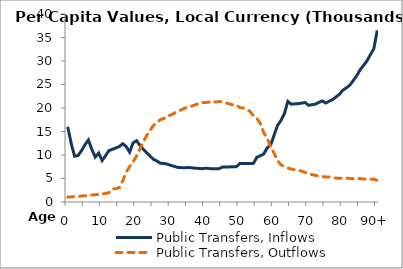
| Category | Public Transfers, Inflows | Public Transfers, Outflows |
|---|---|---|
| 0 | 16000.82 | 1045.959 |
|  | 12501.164 | 1095.797 |
| 2 | 9726.468 | 1143.166 |
| 3 | 9887.669 | 1197.292 |
| 4 | 10917.033 | 1256.027 |
| 5 | 12157.376 | 1331.117 |
| 6 | 13185.985 | 1404.079 |
| 7 | 11217.711 | 1478.851 |
| 8 | 9565.005 | 1554.729 |
| 9 | 10409.218 | 1621.978 |
| 10 | 8830.918 | 1675.22 |
| 11 | 9871.678 | 1847.643 |
| 12 | 10943.74 | 1990.622 |
| 13 | 11212.076 | 2791.878 |
| 14 | 11502.598 | 2841.088 |
| 15 | 11790.371 | 3087.532 |
| 16 | 12399.684 | 4474.458 |
| 17 | 11797.532 | 6336.393 |
| 18 | 10609.519 | 7537.712 |
| 19 | 12583.361 | 8544.975 |
| 20 | 13034.698 | 9774.763 |
| 21 | 12037.059 | 11293.654 |
| 22 | 11183.193 | 12842.268 |
| 23 | 10465.634 | 14183.222 |
| 24 | 9719.062 | 15336.619 |
| 25 | 9048.269 | 16333.851 |
| 26 | 8691.607 | 17009.216 |
| 27 | 8228.677 | 17536.9 |
| 28 | 8197.211 | 17804.588 |
| 29 | 8035.223 | 18296.72 |
| 30 | 7782.108 | 18511.792 |
| 31 | 7579.67 | 18916.234 |
| 32 | 7340.543 | 19241.319 |
| 33 | 7323.218 | 19618.755 |
| 34 | 7261.246 | 19941.262 |
| 35 | 7350.936 | 20209.922 |
| 36 | 7288.927 | 20401.244 |
| 37 | 7189.29 | 20648.723 |
| 38 | 7152.535 | 20917.069 |
| 39 | 7089.404 | 21120.851 |
| 40 | 7183.085 | 21174.739 |
| 41 | 7135.233 | 21248.306 |
| 42 | 7068.366 | 21385.25 |
| 43 | 7094.99 | 21270.912 |
| 44 | 7086.59 | 21365.036 |
| 45 | 7426.679 | 21316.796 |
| 46 | 7458.355 | 21074.225 |
| 47 | 7472.102 | 20875.161 |
| 48 | 7481.109 | 20670.945 |
| 49 | 7480.515 | 20654.36 |
| 50 | 8176.85 | 20090.554 |
| 51 | 8172.635 | 20015.823 |
| 52 | 8180.923 | 19638.219 |
| 53 | 8191.929 | 19294.341 |
| 54 | 8221.994 | 18311.907 |
| 55 | 9519.381 | 17811.806 |
| 56 | 9838.748 | 16696.603 |
| 57 | 10245.421 | 14698.445 |
| 58 | 11506.9 | 13595.685 |
| 59 | 12102.052 | 11695.366 |
| 60 | 14217.798 | 10404.522 |
| 61 | 16295.933 | 8857.115 |
| 62 | 17343.24 | 7902.314 |
| 63 | 18817.616 | 7538.911 |
| 64 | 21409.342 | 7241.001 |
| 65 | 20808.437 | 6998.83 |
| 66 | 20878.012 | 6872.532 |
| 67 | 20910.878 | 6688.362 |
| 68 | 21033.175 | 6593.345 |
| 69 | 21170.056 | 6298.055 |
| 70 | 20569.686 | 6008.559 |
| 71 | 20706.224 | 5830.196 |
| 72 | 20809.849 | 5650.662 |
| 73 | 21191.109 | 5509.538 |
| 74 | 21500.108 | 5380.281 |
| 75 | 21057.061 | 5333.446 |
| 76 | 21435.446 | 5297.863 |
| 77 | 21778.488 | 5140.387 |
| 78 | 22358.653 | 5078.079 |
| 79 | 22910.419 | 5066.928 |
| 80 | 23787.317 | 5070.806 |
| 81 | 24297.9 | 5064.935 |
| 82 | 24848.396 | 5026.276 |
| 83 | 25824.428 | 4979.346 |
| 84 | 26817.533 | 5004.485 |
| 85 | 28126.843 | 4974.232 |
| 86 | 29061.998 | 4887.917 |
| 87 | 30026.873 | 4861.355 |
| 88 | 31351.781 | 4863.494 |
| 89 | 32625.576 | 4845.226 |
| 90+ | 36525.948 | 4593.819 |